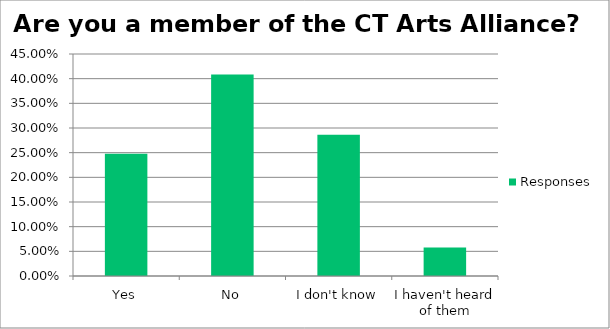
| Category | Responses |
|---|---|
| Yes | 0.248 |
| No | 0.408 |
| I don't know | 0.286 |
| I haven't heard of them | 0.058 |